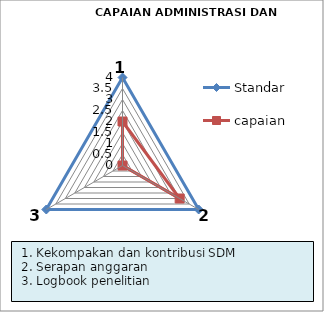
| Category | Standar | capaian |
|---|---|---|
| 0 | 4 | 2 |
| 1 | 4 | 3 |
| 2 | 4 | 0 |